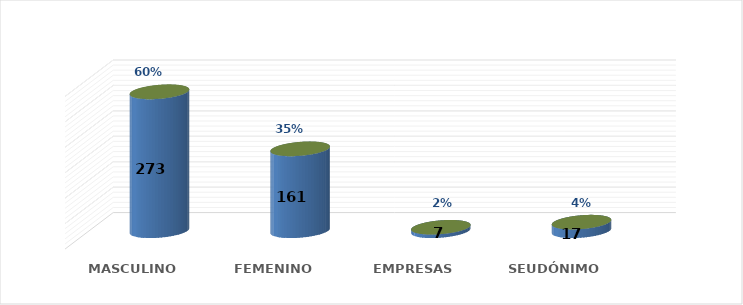
| Category | SOLICITUD POR GÉNERO | Series 1 |
|---|---|---|
| MASCULINO | 273 | 0.596 |
| FEMENINO | 161 | 0.352 |
| EMPRESAS | 7 | 0.015 |
| SEUDÓNIMO | 17 | 0.037 |